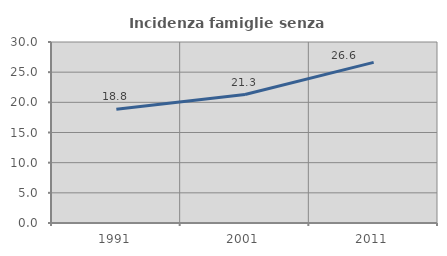
| Category | Incidenza famiglie senza nuclei |
|---|---|
| 1991.0 | 18.842 |
| 2001.0 | 21.297 |
| 2011.0 | 26.622 |